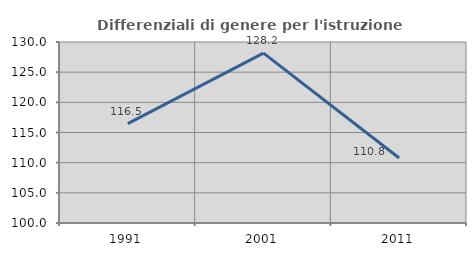
| Category | Differenziali di genere per l'istruzione superiore |
|---|---|
| 1991.0 | 116.465 |
| 2001.0 | 128.164 |
| 2011.0 | 110.773 |